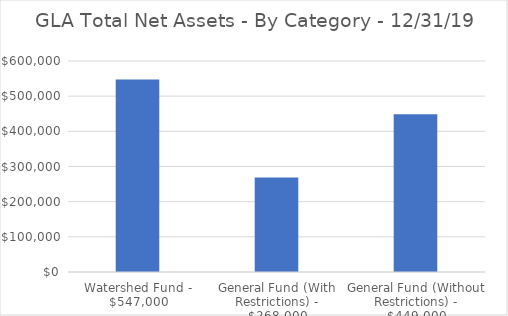
| Category | Series 0 |
|---|---|
| Watershed Fund - $547,000 | 547442 |
| General Fund (With Restrictions) - $268,000 | 268694 |
| General Fund (Without Restrictions) - $449,000 | 448557 |